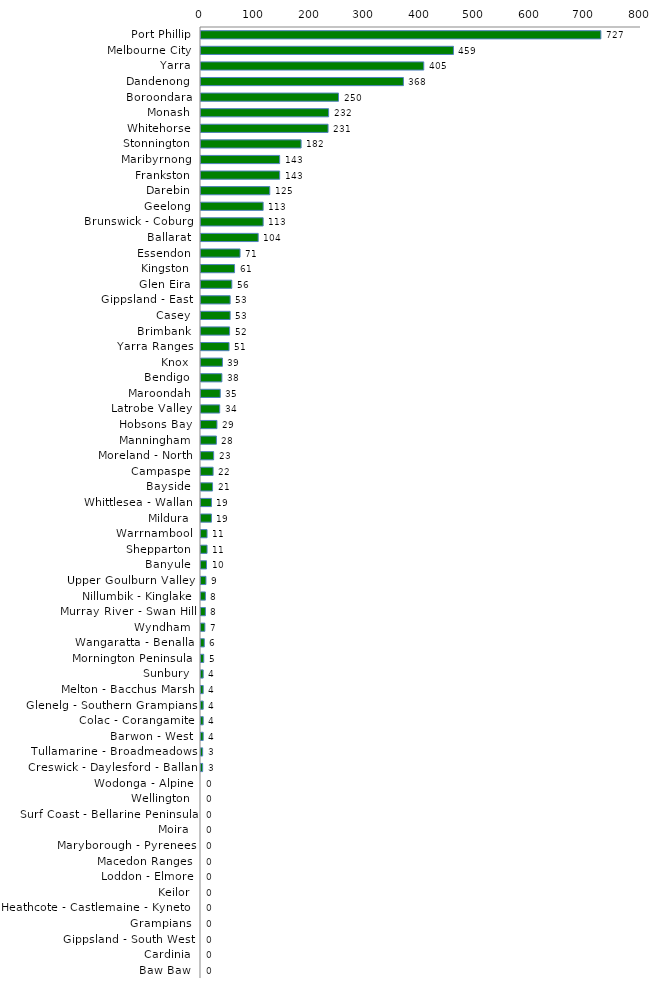
| Category | Series 0 |
|---|---|
| Port Phillip | 727 |
| Melbourne City | 459 |
| Yarra | 405 |
| Dandenong | 368 |
| Boroondara | 250 |
| Monash | 232 |
| Whitehorse | 231 |
| Stonnington | 182 |
| Maribyrnong | 143 |
| Frankston | 143 |
| Darebin | 125 |
| Geelong | 113 |
| Brunswick - Coburg | 113 |
| Ballarat | 104 |
| Essendon | 71 |
| Kingston | 61 |
| Glen Eira | 56 |
| Gippsland - East | 53 |
| Casey | 53 |
| Brimbank | 52 |
| Yarra Ranges | 51 |
| Knox | 39 |
| Bendigo | 38 |
| Maroondah | 35 |
| Latrobe Valley | 34 |
| Hobsons Bay | 29 |
| Manningham | 28 |
| Moreland - North | 23 |
| Campaspe | 22 |
| Bayside | 21 |
| Whittlesea - Wallan | 19 |
| Mildura | 19 |
| Warrnambool | 11 |
| Shepparton | 11 |
| Banyule | 10 |
| Upper Goulburn Valley | 9 |
| Nillumbik - Kinglake | 8 |
| Murray River - Swan Hill | 8 |
| Wyndham | 7 |
| Wangaratta - Benalla | 6 |
| Mornington Peninsula | 5 |
| Sunbury | 4 |
| Melton - Bacchus Marsh | 4 |
| Glenelg - Southern Grampians | 4 |
| Colac - Corangamite | 4 |
| Barwon - West | 4 |
| Tullamarine - Broadmeadows | 3 |
| Creswick - Daylesford - Ballan | 3 |
| Wodonga - Alpine | 0 |
| Wellington | 0 |
| Surf Coast - Bellarine Peninsula | 0 |
| Moira | 0 |
| Maryborough - Pyrenees | 0 |
| Macedon Ranges | 0 |
| Loddon - Elmore | 0 |
| Keilor | 0 |
| Heathcote - Castlemaine - Kyneton | 0 |
| Grampians | 0 |
| Gippsland - South West | 0 |
| Cardinia | 0 |
| Baw Baw | 0 |